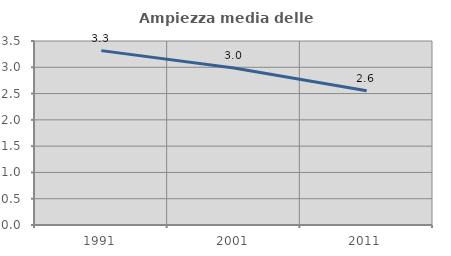
| Category | Ampiezza media delle famiglie |
|---|---|
| 1991.0 | 3.317 |
| 2001.0 | 2.987 |
| 2011.0 | 2.554 |